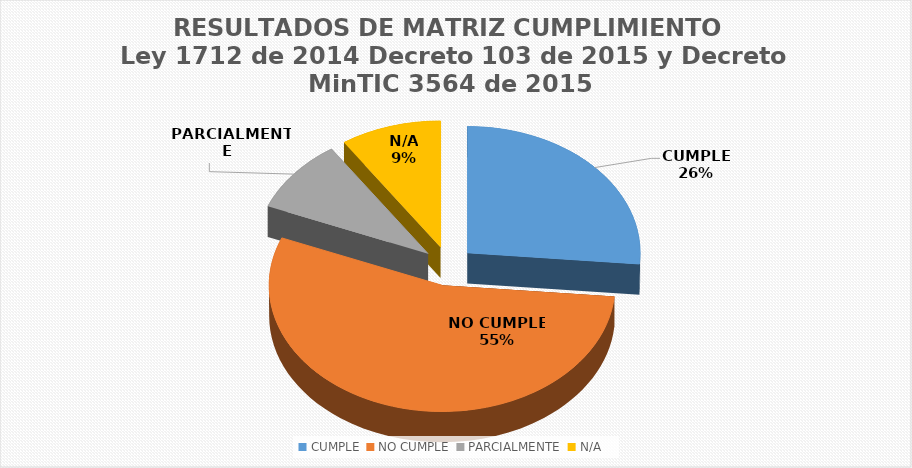
| Category | Series 0 |
|---|---|
| CUMPLE  | 42 |
| NO CUMPLE  | 87 |
| PARCIALMENTE  | 15 |
| N/A | 15 |